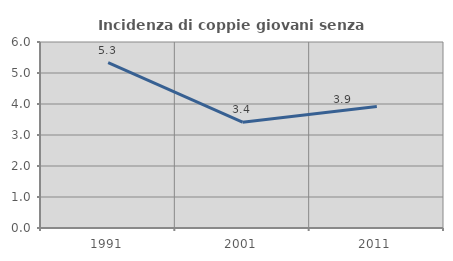
| Category | Incidenza di coppie giovani senza figli |
|---|---|
| 1991.0 | 5.338 |
| 2001.0 | 3.413 |
| 2011.0 | 3.922 |